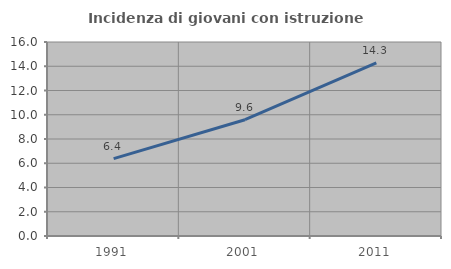
| Category | Incidenza di giovani con istruzione universitaria |
|---|---|
| 1991.0 | 6.383 |
| 2001.0 | 9.589 |
| 2011.0 | 14.286 |